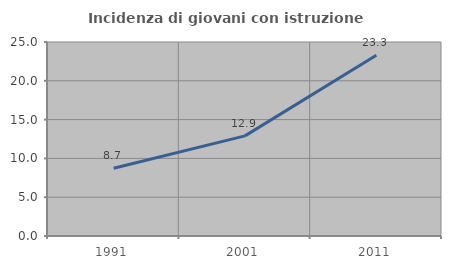
| Category | Incidenza di giovani con istruzione universitaria |
|---|---|
| 1991.0 | 8.738 |
| 2001.0 | 12.903 |
| 2011.0 | 23.301 |